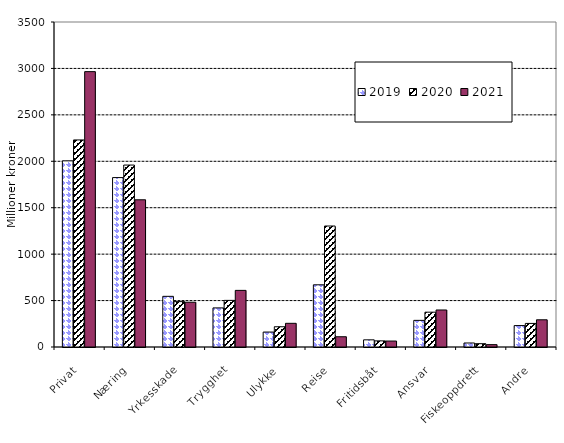
| Category | 2019 | 2020 | 2021 |
|---|---|---|---|
| Privat | 2004.895 | 2229.879 | 2965.42 |
| Næring | 1824.397 | 1959.4 | 1585.404 |
| Yrkesskade | 545.645 | 488.667 | 482.143 |
| Trygghet | 421.08 | 502.103 | 609.675 |
| Ulykke | 160.975 | 218.006 | 254.936 |
| Reise | 669.815 | 1302.937 | 110.552 |
| Fritidsbåt | 77.155 | 66.026 | 64.209 |
| Ansvar | 286.864 | 374.955 | 398.642 |
| Fiskeoppdrett | 43.233 | 35.68 | 25.507 |
| Andre | 230.761 | 253.991 | 293.022 |